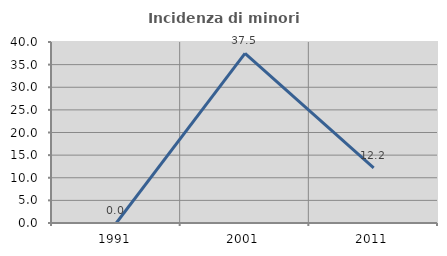
| Category | Incidenza di minori stranieri |
|---|---|
| 1991.0 | 0 |
| 2001.0 | 37.5 |
| 2011.0 | 12.195 |